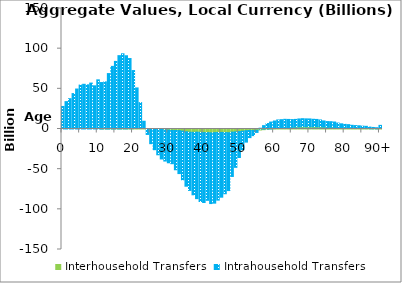
| Category | Interhousehold Transfers | Intrahousehold Transfers |
|---|---|---|
| 0 | 0 | 28079.845 |
|  | 0 | 34077.942 |
| 2 | 0 | 37722.336 |
| 3 | 0 | 44081.584 |
| 4 | 0 | 49757.27 |
| 5 | 0 | 54660.902 |
| 6 | 0 | 55660.916 |
| 7 | 0 | 54984.732 |
| 8 | 0 | 57156.645 |
| 9 | 0 | 53753.912 |
| 10 | 0 | 61201.251 |
| 11 | 0.333 | 57816.63 |
| 12 | 6.941 | 58636.707 |
| 13 | 27.222 | 68954.857 |
| 14 | 50.376 | 77906.112 |
| 15 | 76.894 | 84087.401 |
| 16 | 100.535 | 91210.747 |
| 17 | 103.791 | 93526.785 |
| 18 | 163.202 | 91011.349 |
| 19 | 317.187 | 87398.463 |
| 20 | 435.579 | 72294.692 |
| 21 | 580.321 | 50548.432 |
| 22 | 725.12 | 32074.079 |
| 23 | 670.87 | 8979.458 |
| 24 | 647.339 | -6764.336 |
| 25 | 475.739 | -18263.154 |
| 26 | 245.805 | -25748.169 |
| 27 | -3.648 | -32097.422 |
| 28 | -474.7 | -36804.129 |
| 29 | -995.706 | -38909.061 |
| 30 | -1370.405 | -40686.655 |
| 31 | -1713.882 | -41486.828 |
| 32 | -1919.074 | -48825.885 |
| 33 | -2008.987 | -53488.723 |
| 34 | -2648.04 | -60576.649 |
| 35 | -3456.295 | -67760.662 |
| 36 | -4027.378 | -72434.151 |
| 37 | -4188.567 | -77712.735 |
| 38 | -3985.315 | -82688.883 |
| 39 | -4127.605 | -86138.094 |
| 40 | -4509 | -87003.793 |
| 41 | -4473.329 | -84311.601 |
| 42 | -4777.831 | -88051.997 |
| 43 | -4556.103 | -87734.435 |
| 44 | -4298.974 | -84252.917 |
| 45 | -4269.323 | -80614.077 |
| 46 | -4423.772 | -76173.307 |
| 47 | -4626.736 | -72020.392 |
| 48 | -3912.652 | -55169.726 |
| 49 | -3631.337 | -44101.367 |
| 50 | -3176.46 | -32276.695 |
| 51 | -2735.653 | -23015.756 |
| 52 | -2086.293 | -14233.822 |
| 53 | -1760.385 | -8979.517 |
| 54 | -1873.088 | -6365.265 |
| 55 | -1610.297 | -2658.594 |
| 56 | -1233.811 | 1013.799 |
| 57 | -823.243 | 4184.532 |
| 58 | -357.755 | 6798.736 |
| 59 | 97.676 | 8541.863 |
| 60 | 484.721 | 9487.432 |
| 61 | 874.357 | 10385.795 |
| 62 | 1196.173 | 10402.997 |
| 63 | 1538.84 | 10514.849 |
| 64 | 1819.543 | 10106.82 |
| 65 | 2037.592 | 9678.037 |
| 66 | 2272.099 | 9669.056 |
| 67 | 2518.69 | 10000.702 |
| 68 | 2645.451 | 10174.128 |
| 69 | 2643.46 | 9963.829 |
| 70 | 2669.449 | 9864.001 |
| 71 | 2658.588 | 9452.023 |
| 72 | 2646.014 | 9271.734 |
| 73 | 2512.937 | 8734.462 |
| 74 | 2267.112 | 7776.953 |
| 75 | 2080.094 | 7137.545 |
| 76 | 2046.141 | 7058.185 |
| 77 | 1956.961 | 6757.399 |
| 78 | 1666.101 | 5737.249 |
| 79 | 1453.193 | 5000.409 |
| 80 | 1291.3 | 4482.994 |
| 81 | 1155.051 | 4260.308 |
| 82 | 921.884 | 3678.006 |
| 83 | 802.264 | 3454.776 |
| 84 | 704.928 | 3291.782 |
| 85 | 581.652 | 2950.416 |
| 86 | 513.176 | 2824.946 |
| 87 | 341.015 | 2037.888 |
| 88 | 260.929 | 1681.332 |
| 89 | 196.049 | 1379.488 |
| 90+ | 515.336 | 4011.281 |